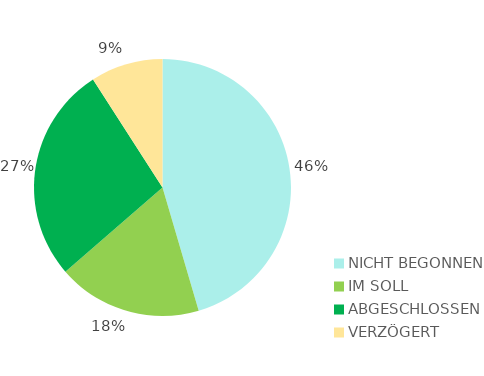
| Category | Series 0 |
|---|---|
| NICHT BEGONNEN | 5 |
| IM SOLL | 2 |
| ABGESCHLOSSEN | 3 |
| VERZÖGERT | 1 |